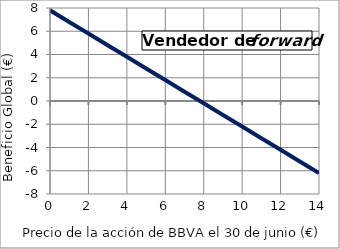
| Category | Comprador |
|---|---|
| 0.0 | 7.8 |
| 1.0 | 6.8 |
| 2.0 | 5.8 |
| 3.0 | 4.8 |
| 4.0 | 3.8 |
| 5.0 | 2.8 |
| 6.0 | 1.8 |
| 7.0 | 0.8 |
| 8.0 | -0.2 |
| 9.0 | -1.2 |
| 10.0 | -2.2 |
| 11.0 | -3.2 |
| 12.0 | -4.2 |
| 13.0 | -5.2 |
| 14.0 | -6.2 |